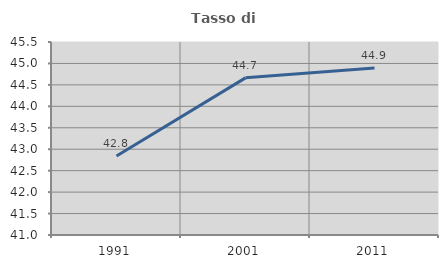
| Category | Tasso di occupazione   |
|---|---|
| 1991.0 | 42.843 |
| 2001.0 | 44.664 |
| 2011.0 | 44.896 |